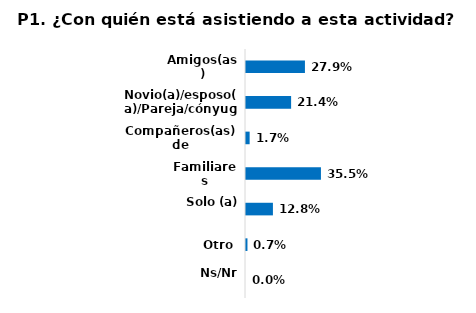
| Category | Series 0 |
|---|---|
| Amigos(as) | 0.279 |
| Novio(a)/esposo(a)/Pareja/cónyuge | 0.214 |
| Compañeros(as) de trabajo/Estudio | 0.017 |
| Familiares | 0.355 |
| Solo (a) | 0.128 |
| Otro  | 0.007 |
| Ns/Nr | 0 |